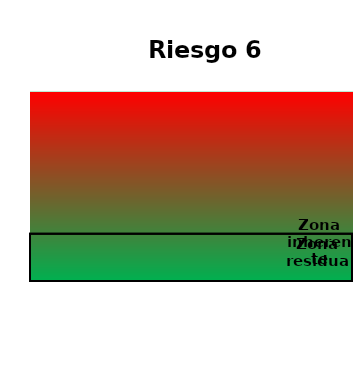
| Category | 4 | Zona Residual | Zona inherente |
|---|---|---|---|
| Riesgo 6 | 4 | 1 | 1 |